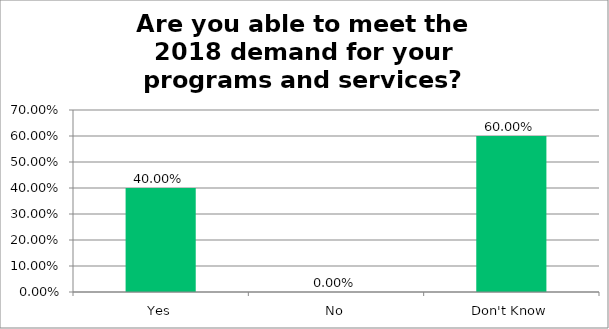
| Category | Responses |
|---|---|
| Yes | 0.4 |
| No | 0 |
| Don't Know | 0.6 |